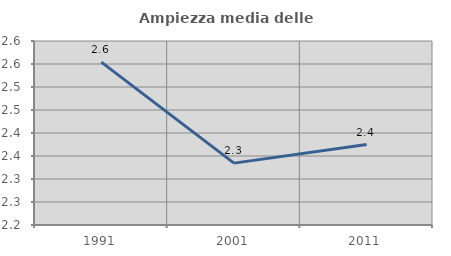
| Category | Ampiezza media delle famiglie |
|---|---|
| 1991.0 | 2.554 |
| 2001.0 | 2.334 |
| 2011.0 | 2.375 |